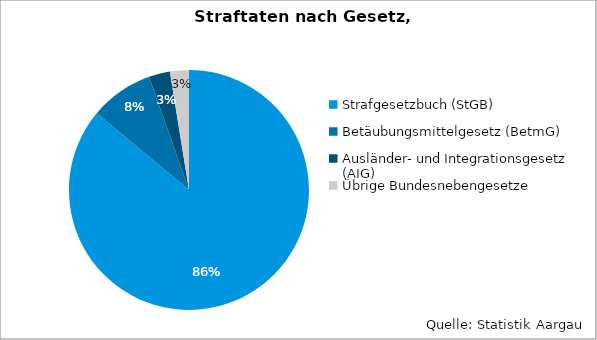
| Category | Series 0 |
|---|---|
| Strafgesetzbuch (StGB) | 33647 |
| Betäubungsmittelgesetz (BetmG) | 3339 |
| Ausländer- und Integrationsgesetz (AIG) | 1114 |
| Übrige Bundesnebengesetze | 999 |